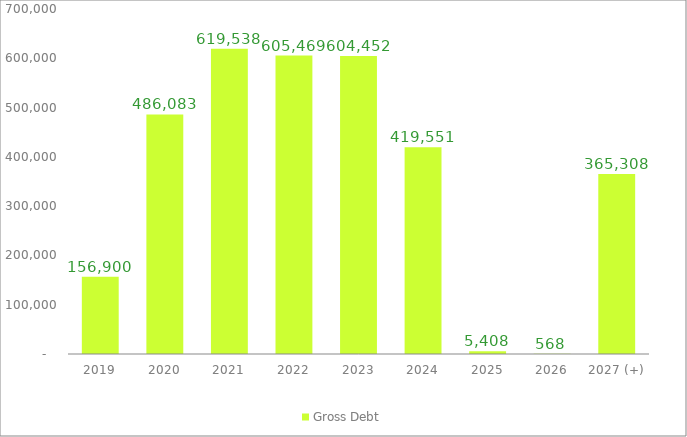
| Category | Gross Debt |
|---|---|
| 2019 | 156899.945 |
| 2020 | 486082.514 |
| 2021 | 619537.651 |
| 2022 | 605468.881 |
| 2023 | 604451.608 |
| 2024 | 419550.566 |
| 2025 | 5407.91 |
| 2026 | 567.533 |
| 2027 (+) | 365308.238 |